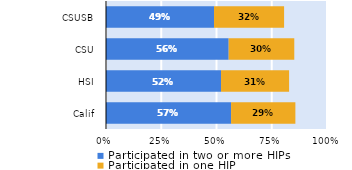
| Category | Participated in two or more HIPs | Participated in one HIP |
|---|---|---|
| Calif | 0.566 | 0.291 |
| HSI | 0.52 | 0.308 |
| CSU | 0.555 | 0.297 |
| CSUSB | 0.489 | 0.317 |